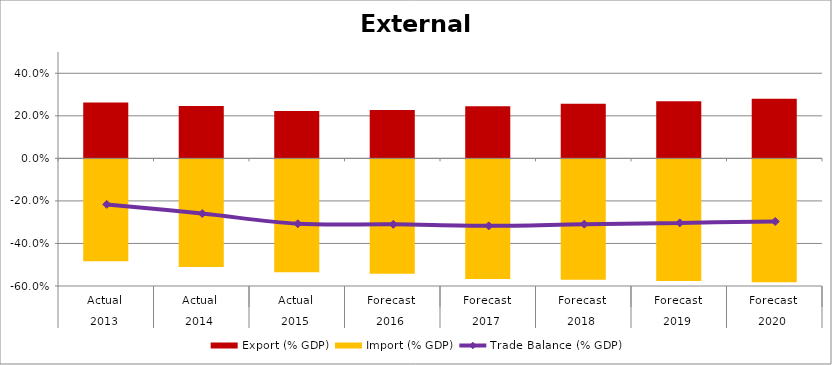
| Category | Export (% GDP) | Import (% GDP) |
|---|---|---|
| 0 | 0.263 | -0.479 |
| 1 | 0.247 | -0.506 |
| 2 | 0.223 | -0.531 |
| 3 | 0.228 | -0.538 |
| 4 | 0.245 | -0.562 |
| 5 | 0.257 | -0.566 |
| 6 | 0.268 | -0.572 |
| 7 | 0.281 | -0.578 |